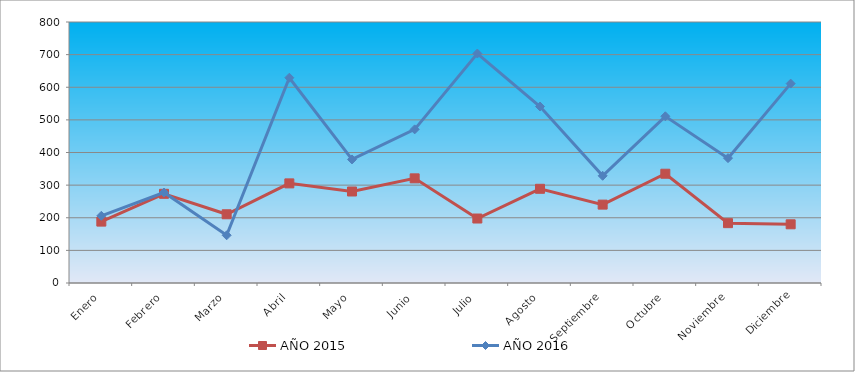
| Category | AÑO 2015 | AÑO 2016 |
|---|---|---|
| Enero | 188.185 | 205.955 |
| Febrero | 273.401 | 277.292 |
| Marzo | 210.672 | 146.278 |
| Abril | 305.356 | 629.196 |
| Mayo | 280.502 | 378.72 |
| Junio | 320.743 | 470.895 |
| Julio | 197.653 | 703.337 |
| Agosto | 288.787 | 541.028 |
| Septiembre | 240.261 | 328.624 |
| Octubre | 334.945 | 510.971 |
| Noviembre | 183.451 | 382.727 |
| Diciembre | 179.9 | 611.161 |